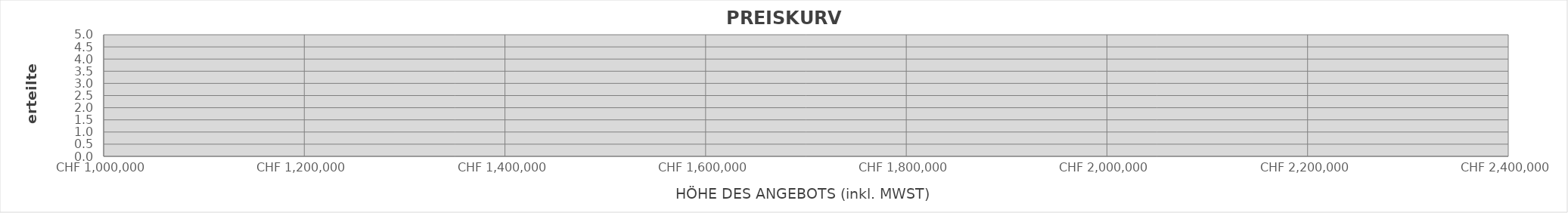
| Category | SCHLUSSNOTE  |
|---|---|
|  | 0 |
|  | 0 |
|  | 0 |
|  | 0 |
|  | 0 |
|  | 0 |
|  | 0 |
|  | 0 |
|  | 0 |
|  | 0 |
|  | 0 |
|  | 0 |
|  | 0 |
|  | 0 |
|  | 0 |